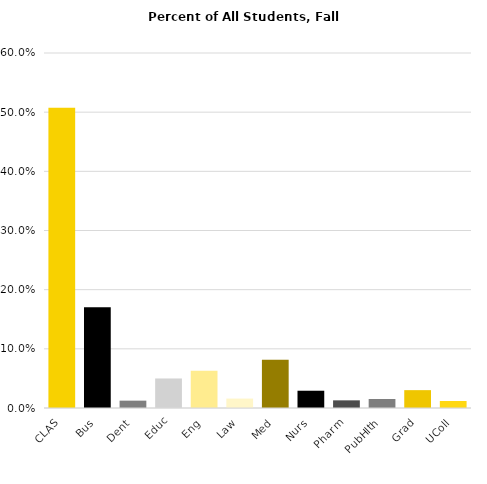
| Category | Series 0 |
|---|---|
| CLAS | 0.507 |
| Bus | 0.17 |
| Dent | 0.012 |
| Educ | 0.05 |
| Eng | 0.063 |
| Law | 0.016 |
| Med | 0.082 |
| Nurs | 0.029 |
| Pharm | 0.013 |
| PubHlth | 0.015 |
| Grad | 0.03 |
| UColl | 0.012 |